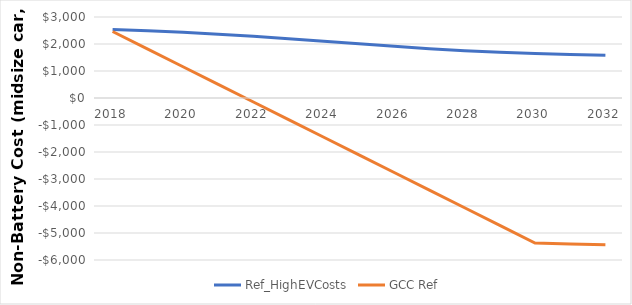
| Category | Ref_HighEVCosts | GCC Ref |
|---|---|---|
| 2018.0 | 2538.504 | 2462.231 |
| 2019.0 | 2489.449 | 1809.462 |
| 2020.0 | 2430.917 | 1156.692 |
| 2021.0 | 2362.18 | 503.923 |
| 2022.0 | 2283.264 | -148.846 |
| 2023.0 | 2195.392 | -801.615 |
| 2024.0 | 2101.314 | -1454.385 |
| 2025.0 | 2005.265 | -2107.154 |
| 2026.0 | 1912.356 | -2759.923 |
| 2027.0 | 1827.508 | -3412.692 |
| 2028.0 | 1754.324 | -4065.462 |
| 2029.0 | 1694.444 | -4718.231 |
| 2030.0 | 1647.589 | -5371 |
| 2031.0 | 1612.12 | -5406.463 |
| 2032.0 | 1585.773 | -5432.807 |